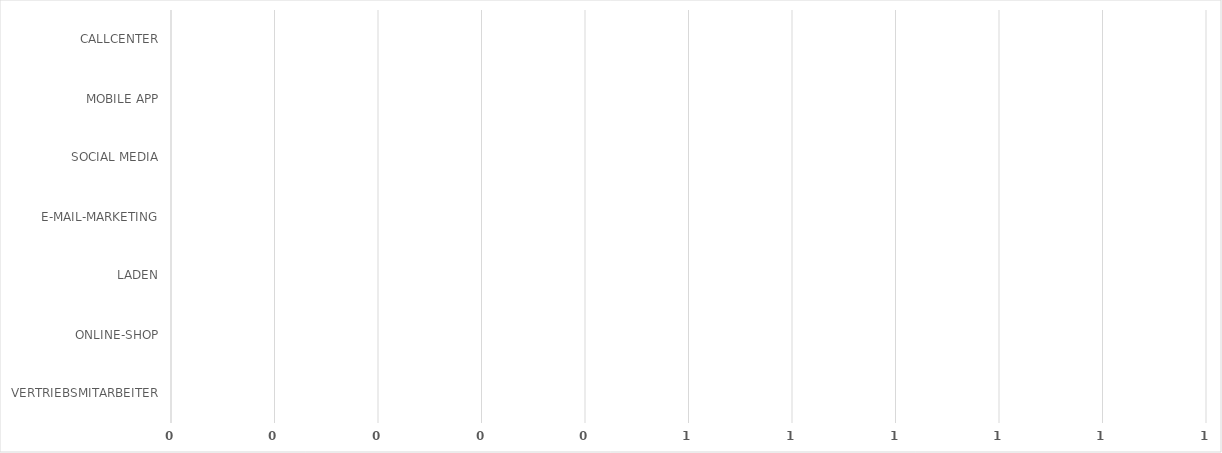
| Category | Series 0 |
|---|---|
| VERTRIEBSMITARBEITER | 0 |
| ONLINE-SHOP | 0 |
| LADEN | 0 |
| E-MAIL-MARKETING | 0 |
| SOCIAL MEDIA | 0 |
| MOBILE APP | 0 |
| CALLCENTER | 0 |